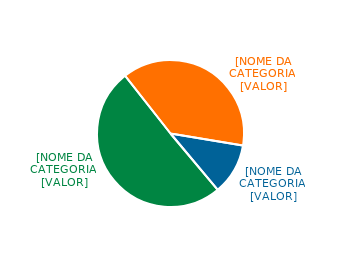
| Category | Series 0 |
|---|---|
| Controlling group | 0.505 |
| Non-Brazilian investors * | 0.382 |
| Brazilian investors * | 0.113 |